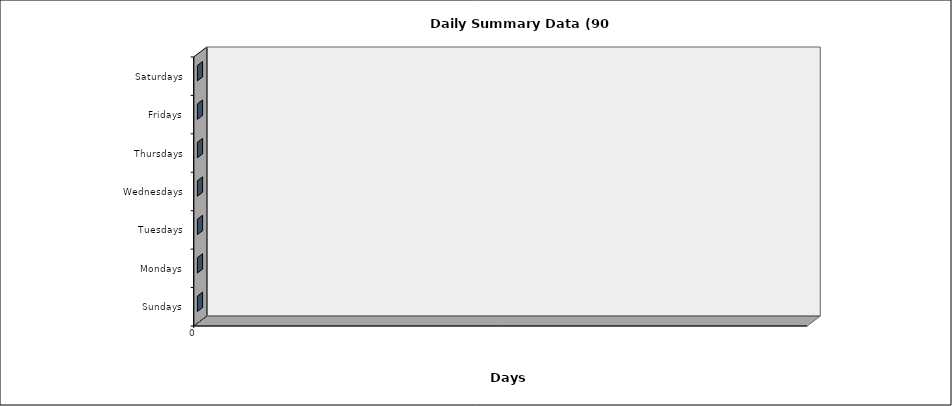
| Category | Series 0 |
|---|---|
| Sundays | 0 |
| Mondays | 0 |
| Tuesdays | 0 |
| Wednesdays | 0 |
| Thursdays | 0 |
| Fridays | 0 |
| Saturdays | 0 |